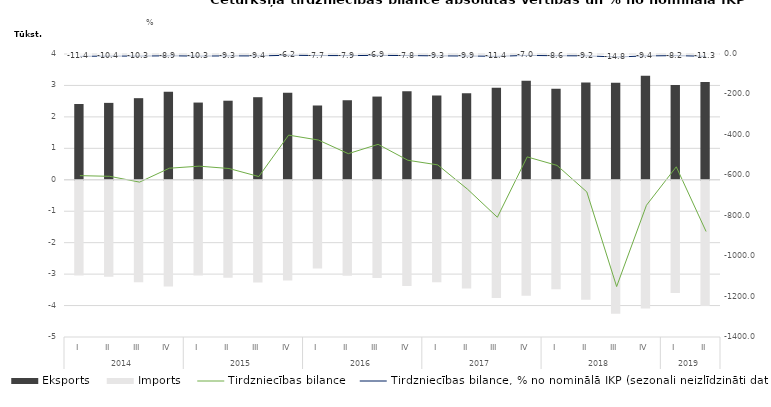
| Category | Eksports | Imports |
|---|---|---|
| 0 | 2410.6 | -3012.4 |
| 1 | 2445.8 | -3050.9 |
| 2 | 2595.1 | -3228.9 |
| 3 | 2797.1 | -3362.1 |
| 4 | 2455.7 | -3010.6 |
| 5 | 2514.6 | -3081.1 |
| 6 | 2626 | -3232.3 |
| 7 | 2766.9 | -3168.2 |
| 8 | 2362.6 | -2788.3 |
| 9 | 2529.5 | -3022.6 |
| 10 | 2646.4 | -3093.3 |
| 11 | 2819.2 | -3345 |
| 12 | 2681.2 | -3229.7 |
| 13 | 2753.3 | -3422.2 |
| 14 | 2922.9 | -3730.5 |
| 15 | 3149.7 | -3658.7 |
| 16 | 2895.5 | -3446.6 |
| 17 | 3097.3 | -3779.7 |
| 18 | 3082.2 | -4232.7 |
| 19 | 3310.7 | -4058.8 |
| 20 | 3012.8 | -3570.9 |
| 21 | 3107.7 | -3985.7 |